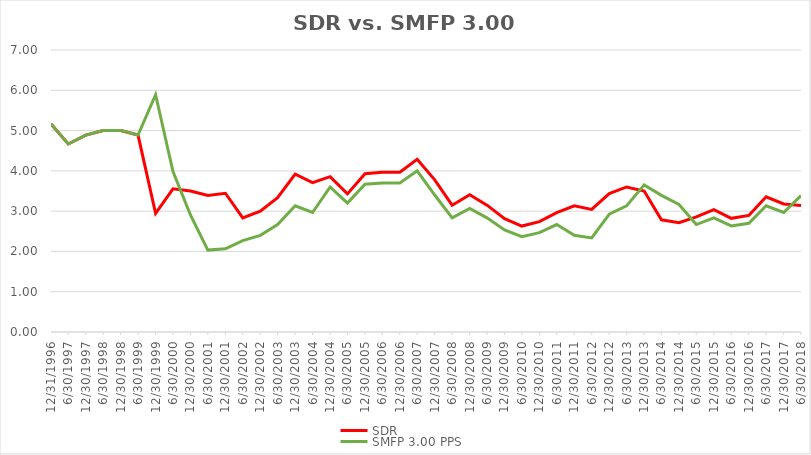
| Category | SDR | SMFP 3.00 PPS |
|---|---|---|
| 12/31/96 | 5.167 | 5.167 |
| 6/30/97 | 4.667 | 4.667 |
| 12/31/97 | 4.889 | 4.889 |
| 6/30/98 | 5 | 5 |
| 12/31/98 | 5 | 5 |
| 6/30/99 | 4.889 | 4.889 |
| 12/31/99 | 2.944 | 5.889 |
| 6/30/00 | 3.556 | 3.982 |
| 12/31/00 | 3.5 | 2.898 |
| 6/30/01 | 3.389 | 2.033 |
| 12/31/01 | 3.444 | 2.067 |
| 6/30/02 | 2.833 | 2.267 |
| 12/31/02 | 3 | 2.4 |
| 6/30/03 | 3.333 | 2.667 |
| 12/31/03 | 3.917 | 3.133 |
| 6/30/04 | 3.708 | 2.967 |
| 12/31/04 | 3.857 | 3.6 |
| 6/30/05 | 3.429 | 3.2 |
| 12/31/05 | 3.929 | 3.667 |
| 6/30/06 | 3.964 | 3.7 |
| 12/31/06 | 3.964 | 3.7 |
| 6/30/07 | 4.286 | 4 |
| 12/31/07 | 3.778 | 3.4 |
| 6/30/08 | 3.148 | 2.833 |
| 12/31/08 | 3.407 | 3.067 |
| 6/30/09 | 3.148 | 2.833 |
| 12/31/09 | 2.815 | 2.533 |
| 6/30/10 | 2.63 | 2.367 |
| 12/31/10 | 2.741 | 2.467 |
| 6/30/11 | 2.963 | 2.667 |
| 12/31/11 | 3.13 | 2.4 |
| 6/30/12 | 3.043 | 2.333 |
| 12/31/12 | 3.435 | 2.926 |
| 6/30/13 | 3.6 | 3.13 |
| 12/31/13 | 3.5 | 3.652 |
| 6/30/14 | 2.786 | 3.391 |
| 12/31/14 | 2.714 | 3.167 |
| 6/30/15 | 2.857 | 2.667 |
| 12/31/15 | 3.036 | 2.833 |
| 6/30/16 | 2.821 | 2.633 |
| 12/31/16 | 2.893 | 2.7 |
| 6/30/17 | 3.357 | 3.133 |
| 12/31/17 | 3.179 | 2.967 |
| 6/30/18 | 3.143 | 3.385 |